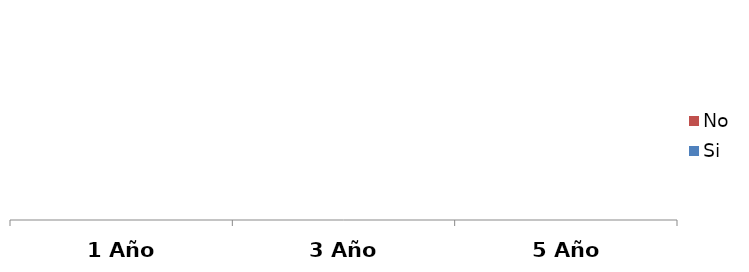
| Category | Si | No |
|---|---|---|
| 1 Año | 0 | 0 |
| 3 Año | 0 | 0 |
| 5 Año | 0 | 0 |